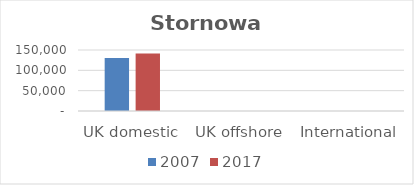
| Category | 2007 | 2017 |
|---|---|---|
| UK domestic | 130441 | 141613 |
| UK offshore | 0 | 0 |
| International | 0 | 0 |